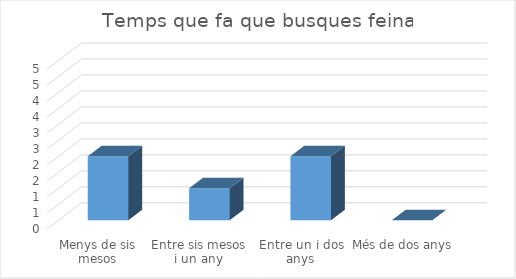
| Category | Series 0 |
|---|---|
| Menys de sis mesos | 2 |
| Entre sis mesos i un any | 1 |
| Entre un i dos anys | 2 |
| Més de dos anys | 0 |